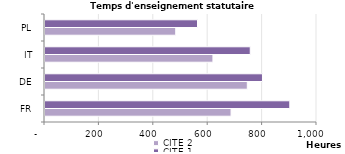
| Category | CITE 2 | CITE 1 |
|---|---|---|
| FR | 684 | 900 |
| DE | 743.769 | 799.543 |
| IT | 617.4 | 754.6 |
| PL | 480.6 | 560.7 |